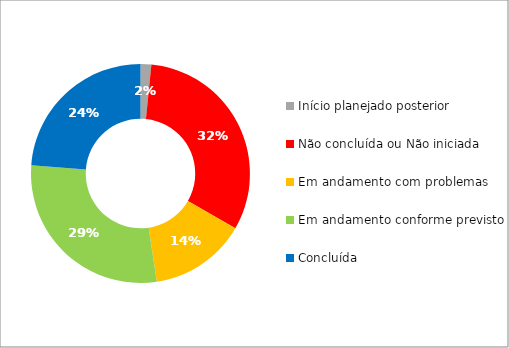
| Category | Series 0 |
|---|---|
| Início planejado posterior | 1 |
| Não concluída ou Não iniciada | 20 |
| Em andamento com problemas | 9 |
| Em andamento conforme previsto | 18 |
| Concluída | 15 |